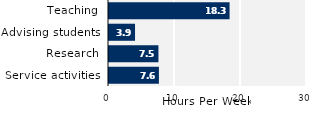
| Category | Series 0 |
|---|---|
| Service activities | 7.562 |
| Research | 7.49 |
| Advising students | 3.944 |
| Teaching | 18.268 |